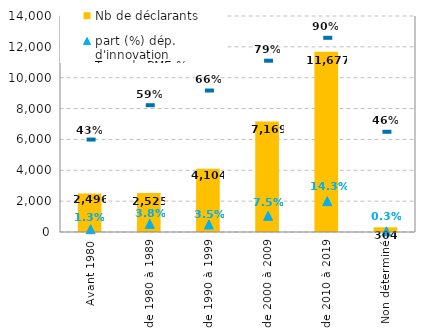
| Category | Nb de déclarants |
|---|---|
| Avant 1980 | 2496 |
| de 1980 à 1989 | 2525 |
| de 1990 à 1999 | 4104 |
| de 2000 à 2009 | 7169 |
| de 2010 à 2019 | 11677 |
| Non déterminé | 304 |